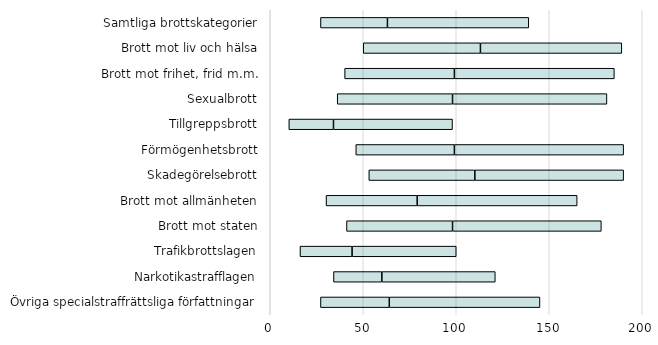
| Category | KV1 | KV2 | KV3 |
|---|---|---|---|
| Övriga specialstraffrättsliga författningar | 27 | 37 | 81 |
| Narkotikastrafflagen | 34 | 26 | 61 |
| Trafikbrottslagen | 16 | 28 | 56 |
| Brott mot staten | 41 | 57 | 80 |
| Brott mot allmänheten | 30 | 49 | 86 |
| Skadegörelsebrott | 53 | 57 | 80 |
| Förmögenhetsbrott | 46 | 53 | 91 |
| Tillgreppsbrott | 10 | 24 | 64 |
| Sexualbrott | 36 | 62 | 83 |
| Brott mot frihet, frid m.m. | 40 | 59 | 86 |
| Brott mot liv och hälsa | 50 | 63 | 76 |
| Samtliga brottskategorier | 27 | 36 | 76 |